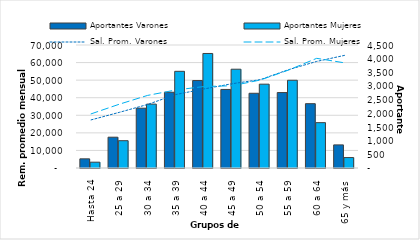
| Category | Aportantes Varones | Aportantes Mujeres |
|---|---|---|
| Hasta 24 | 335 | 213 |
| 25 a 29 | 1127 | 999 |
| 30 a 34 | 2188 | 2337 |
| 35 a 39 | 2771 | 3537 |
| 40 a 44 | 3200 | 4190 |
| 45 a 49 | 2874 | 3614 |
| 50 a 54 | 2734 | 3067 |
| 55 a 59 | 2760 | 3210 |
| 60 a 64 | 2353 | 1659 |
| 65 y más | 845 | 382 |